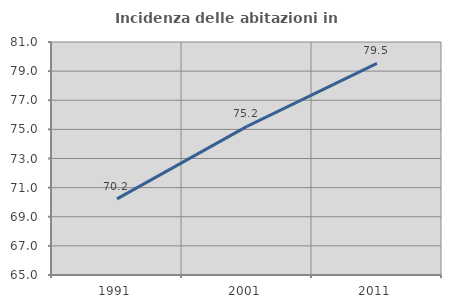
| Category | Incidenza delle abitazioni in proprietà  |
|---|---|
| 1991.0 | 70.224 |
| 2001.0 | 75.21 |
| 2011.0 | 79.525 |